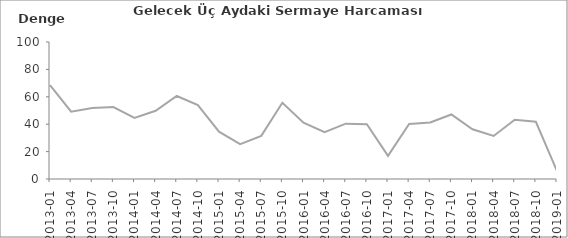
| Category | Gelecek Üç Aydaki Sermaye Harcaması Beklentisi |
|---|---|
| 2013-01 | 68.5 |
| 2013-04 | 49.1 |
| 2013-07 | 51.9 |
| 2013-10 | 52.5 |
| 2014-01 | 44.6 |
| 2014-04 | 49.8 |
| 2014-07 | 60.6 |
| 2014-10 | 53.9 |
| 2015-01 | 34.5 |
| 2015-04 | 25.5 |
| 2015-07 | 31.5 |
| 2015-10 | 55.7 |
| 2016-01 | 41.1 |
| 2016-04 | 34.2 |
| 2016-07 | 40.4 |
| 2016-10 | 40 |
| 2017-01 | 16.9 |
| 2017-04 | 40.2 |
| 2017-07 | 41.2 |
| 2017-10 | 47.1 |
| 2018-01 | 36.3 |
| 2018-04 | 31.4 |
| 2018-07 | 43.2 |
| 2018-10 | 41.8 |
| 2019-01 | 5.8 |